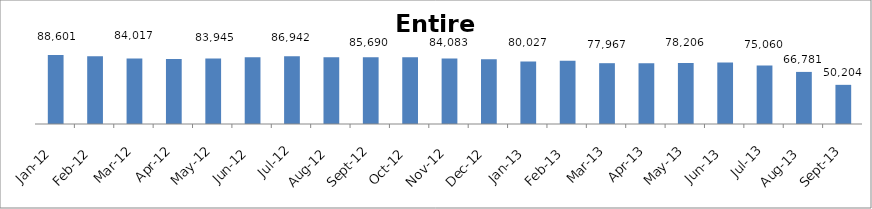
| Category | Inactive Premise with UKU |
|---|---|
| 2012-01-01 | 88601 |
| 2012-02-01 | 86741 |
| 2012-03-01 | 84017 |
| 2012-04-01 | 83376 |
| 2012-05-01 | 83945 |
| 2012-06-01 | 85671 |
| 2012-07-01 | 86942 |
| 2012-08-01 | 85723 |
| 2012-09-01 | 85690 |
| 2012-10-01 | 85608 |
| 2012-11-01 | 84083 |
| 2012-12-01 | 82943 |
| 2013-01-01 | 80027 |
| 2013-02-01 | 80994 |
| 2013-03-01 | 77967 |
| 2013-04-01 | 77730 |
| 2013-05-01 | 78206 |
| 2013-06-01 | 78893 |
| 2013-07-01 | 75060 |
| 2013-08-01 | 66781 |
| 2013-09-01 | 50204 |